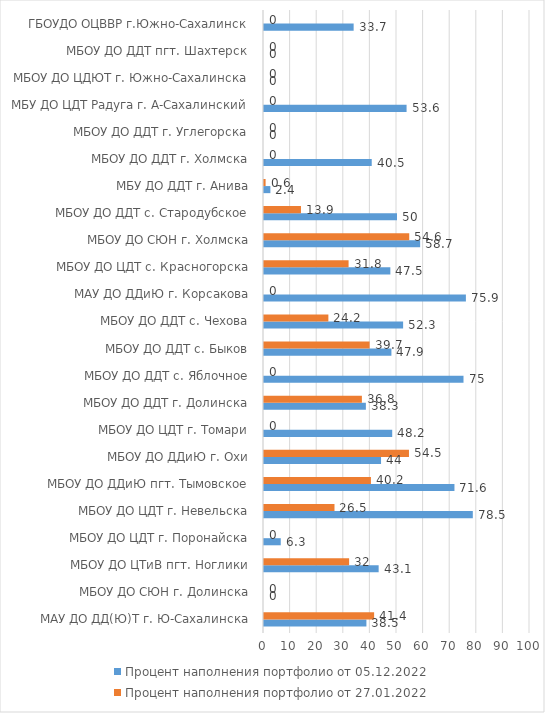
| Category | Процент наполнения портфолио от 05.12.2022 | Процент наполнения портфолио от 27.01.2022 |
|---|---|---|
| МАУ ДО ДД(Ю)Т г. Ю-Сахалинска | 38.5 | 41.4 |
| МБОУ ДО СЮН г. Долинска | 0 | 0 |
| МБОУ ДО ЦТиВ пгт. Ноглики | 43.1 | 32 |
| МБОУ ДО ЦДТ г. Поронайска | 6.3 | 0 |
| МБОУ ДО ЦДТ г. Невельска | 78.5 | 26.5 |
| МБОУ ДО ДДиЮ пгт. Тымовское | 71.6 | 40.2 |
| МБОУ ДО ДДиЮ г. Охи | 44 | 54.5 |
| МБОУ ДО ЦДТ г. Томари | 48.2 | 0 |
| МБОУ ДО ДДТ г. Долинска | 38.3 | 36.8 |
| МБОУ ДО ДДТ с. Яблочное | 75 | 0 |
| МБОУ ДО ДДТ с. Быков | 47.9 | 39.7 |
| МБОУ ДО ДДТ с. Чехова | 52.3 | 24.2 |
| МАУ ДО ДДиЮ г. Корсакова | 75.9 | 0 |
| МБОУ ДО ЦДТ с. Красногорска | 47.5 | 31.8 |
| МБОУ ДО СЮН г. Холмска | 58.7 | 54.6 |
| МБОУ ДО ДДТ с. Стародубское | 50 | 13.9 |
| МБУ ДО ДДТ г. Анива | 2.4 | 0.6 |
| МБОУ ДО ДДТ г. Холмска | 40.5 | 0 |
| МБОУ ДО ДДТ г. Углегорска | 0 | 0 |
| МБУ ДО ЦДТ Радуга г. А-Сахалинский | 53.6 | 0 |
| МБОУ ДО ЦДЮТ г. Южно-Сахалинска | 0 | 0 |
| МБОУ ДО ДДТ пгт. Шахтерск | 0 | 0 |
| ГБОУДО ОЦВВР г.Южно-Сахалинск | 33.7 | 0 |